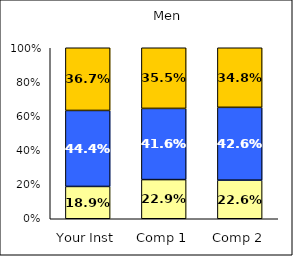
| Category | Low Academic Self-Concept | Average Academic Self-Concept | High Academic Self-Concept |
|---|---|---|---|
| Your Inst | 0.189 | 0.444 | 0.367 |
| Comp 1 | 0.229 | 0.416 | 0.355 |
| Comp 2 | 0.226 | 0.426 | 0.348 |